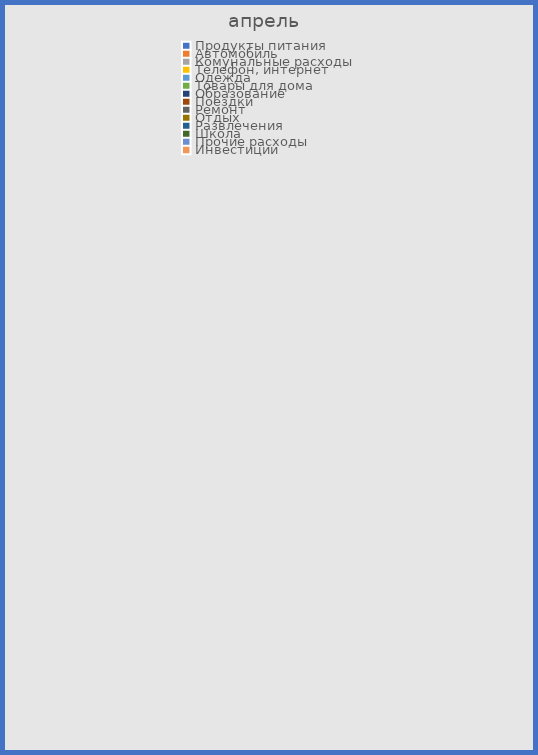
| Category | Series 1 |
|---|---|
| Продукты питания | 0 |
| Автомобиль | 0 |
| Комунальные расходы | 0 |
| Телефон, интернет | 0 |
| Одежда | 0 |
| Товары для дома | 0 |
| Образование | 0 |
| Поездки | 0 |
| Ремонт | 0 |
| Отдых | 0 |
| Развлечения | 0 |
| Школа | 0 |
| Прочие расходы | 0 |
| Инвестиции | 0 |